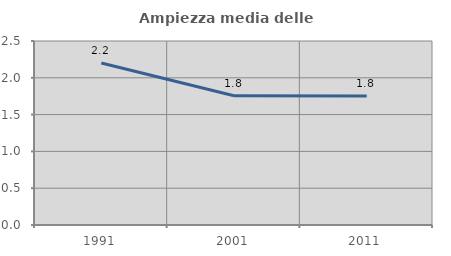
| Category | Ampiezza media delle famiglie |
|---|---|
| 1991.0 | 2.2 |
| 2001.0 | 1.755 |
| 2011.0 | 1.753 |